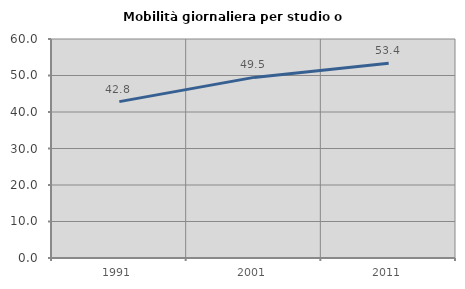
| Category | Mobilità giornaliera per studio o lavoro |
|---|---|
| 1991.0 | 42.84 |
| 2001.0 | 49.484 |
| 2011.0 | 53.36 |